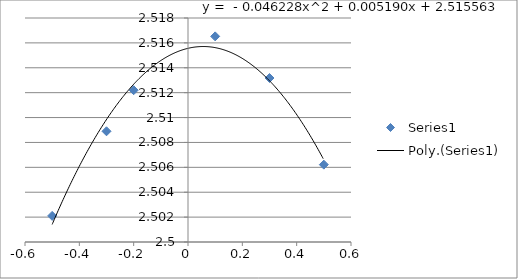
| Category | Series 0 |
|---|---|
| -0.5 | 2.502 |
| -0.3 | 2.509 |
| -0.2 | 2.512 |
| 0.1 | 2.517 |
| 0.3 | 2.513 |
| 0.5 | 2.506 |